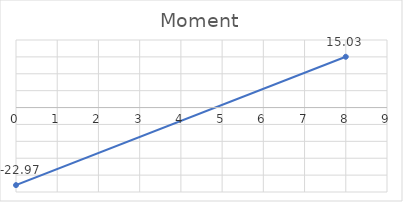
| Category | Series 0 |
|---|---|
| 0.0 | -22.966 |
| 8.0 | 15.034 |